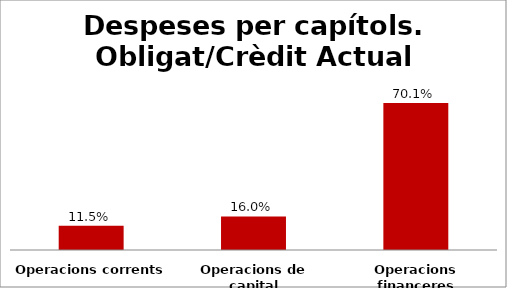
| Category | Series 0 |
|---|---|
| Operacions corrents | 0.115 |
| Operacions de capital | 0.16 |
| Operacions financeres | 0.701 |